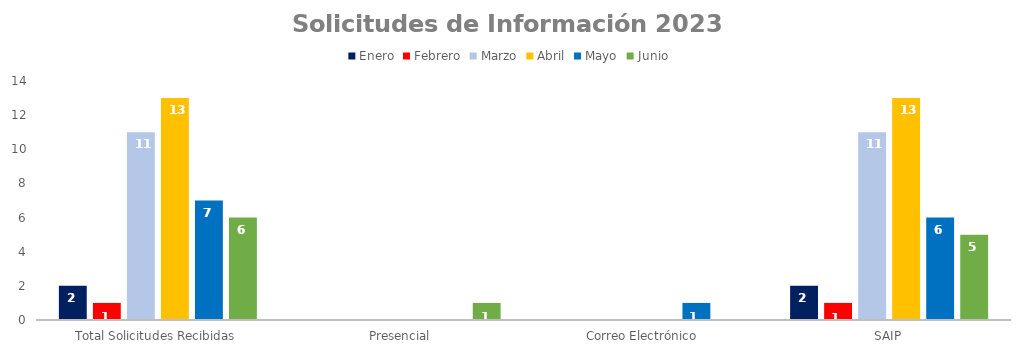
| Category | Enero | Febrero | Marzo | Abril | Mayo | Junio |
|---|---|---|---|---|---|---|
| Total Solicitudes Recibidas | 2 | 1 | 11 | 13 | 7 | 6 |
| Presencial | 0 | 0 | 0 | 0 | 0 | 1 |
| Correo Electrónico  | 0 | 0 | 0 | 0 | 1 | 0 |
| SAIP | 2 | 1 | 11 | 13 | 6 | 5 |